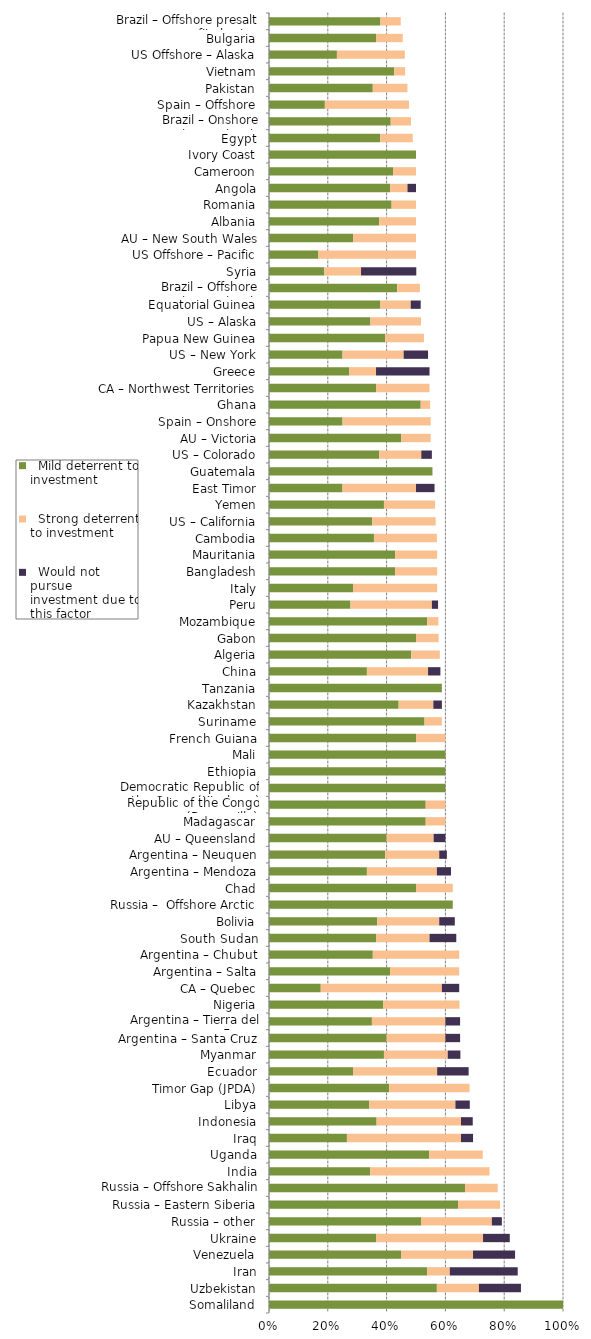
| Category |   Mild deterrent to investment |   Strong deterrent to investment |   Would not pursue investment due to this factor |
|---|---|---|---|
| Somaliland | 1 | 0 | 0 |
| Uzbekistan | 0.571 | 0.143 | 0.143 |
| Iran | 0.538 | 0.077 | 0.231 |
| Venezuela | 0.449 | 0.245 | 0.143 |
| Ukraine | 0.364 | 0.364 | 0.091 |
| Russia – other | 0.517 | 0.241 | 0.034 |
| Russia – Eastern Siberia | 0.643 | 0.143 | 0 |
| Russia – Offshore Sakhalin | 0.667 | 0.111 | 0 |
| India | 0.344 | 0.406 | 0 |
| Uganda | 0.545 | 0.182 | 0 |
| Iraq | 0.265 | 0.388 | 0.041 |
| Indonesia | 0.366 | 0.287 | 0.04 |
| Libya | 0.341 | 0.293 | 0.049 |
| Timor Gap (JPDA) | 0.409 | 0.273 | 0 |
| Ecuador | 0.286 | 0.286 | 0.107 |
| Myanmar | 0.391 | 0.217 | 0.043 |
| Argentina – Santa Cruz | 0.4 | 0.2 | 0.05 |
| Argentina – Tierra del Fuego | 0.35 | 0.25 | 0.05 |
| Nigeria | 0.389 | 0.259 | 0 |
| CA – Quebec | 0.176 | 0.412 | 0.059 |
| Argentina – Salta | 0.412 | 0.235 | 0 |
| Argentina – Chubut | 0.353 | 0.294 | 0 |
| South Sudan | 0.364 | 0.182 | 0.091 |
| Bolivia | 0.368 | 0.211 | 0.053 |
| Russia –  Offshore Arctic | 0.625 | 0 | 0 |
| Chad | 0.5 | 0.125 | 0 |
| Argentina – Mendoza | 0.333 | 0.238 | 0.048 |
| Argentina – Neuquen | 0.395 | 0.184 | 0.026 |
| AU – Queensland | 0.4 | 0.16 | 0.04 |
| Madagascar | 0.533 | 0.067 | 0 |
| Republic of the Congo (Brazzaville) | 0.533 | 0.067 | 0 |
| Democratic Republic of the Congo (Kinshasa) | 0.6 | 0 | 0 |
| Ethiopia | 0.6 | 0 | 0 |
| Mali | 0.6 | 0 | 0 |
| French Guiana | 0.5 | 0.1 | 0 |
| Suriname | 0.529 | 0.059 | 0 |
| Kazakhstan | 0.441 | 0.118 | 0.029 |
| Tanzania | 0.588 | 0 | 0 |
| China | 0.333 | 0.208 | 0.042 |
| Algeria | 0.484 | 0.097 | 0 |
| Gabon | 0.5 | 0.077 | 0 |
| Mozambique | 0.538 | 0.038 | 0 |
| Peru | 0.277 | 0.277 | 0.021 |
| Italy | 0.286 | 0.286 | 0 |
| Bangladesh | 0.429 | 0.143 | 0 |
| Mauritania | 0.429 | 0.143 | 0 |
| Cambodia | 0.357 | 0.214 | 0 |
| US – California | 0.351 | 0.216 | 0 |
| Yemen | 0.391 | 0.174 | 0 |
| East Timor | 0.25 | 0.25 | 0.063 |
| Guatemala | 0.556 | 0 | 0 |
| US – Colorado | 0.375 | 0.143 | 0.036 |
| AU – Victoria | 0.45 | 0.1 | 0 |
| Spain – Onshore | 0.25 | 0.3 | 0 |
| Ghana | 0.516 | 0.032 | 0 |
| CA – Northwest Territories | 0.364 | 0.182 | 0 |
| Greece | 0.273 | 0.091 | 0.182 |
| US – New York | 0.25 | 0.208 | 0.083 |
| Papua New Guinea | 0.395 | 0.132 | 0 |
| US – Alaska | 0.345 | 0.172 | 0 |
| Equatorial Guinea | 0.379 | 0.103 | 0.034 |
| Brazil – Offshore concession contracts | 0.436 | 0.077 | 0 |
| Syria | 0.188 | 0.125 | 0.188 |
| US Offshore – Pacific | 0.167 | 0.333 | 0 |
| AU – New South Wales | 0.286 | 0.214 | 0 |
| Albania | 0.375 | 0.125 | 0 |
| Romania | 0.417 | 0.083 | 0 |
| Angola | 0.412 | 0.059 | 0.029 |
| Cameroon | 0.423 | 0.077 | 0 |
| Ivory Coast | 0.5 | 0 | 0 |
| Egypt | 0.378 | 0.111 | 0 |
| Brazil – Onshore concession contracts | 0.414 | 0.069 | 0 |
| Spain – Offshore | 0.19 | 0.286 | 0 |
| Pakistan | 0.353 | 0.118 | 0 |
| Vietnam | 0.426 | 0.037 | 0 |
| US Offshore – Alaska | 0.231 | 0.231 | 0 |
| Bulgaria | 0.364 | 0.091 | 0 |
| Brazil – Offshore presalt area profit sharing contracts | 0.379 | 0.069 | 0 |